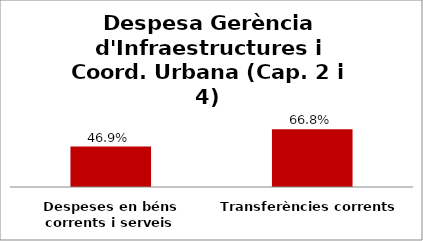
| Category | Series 0 |
|---|---|
| Despeses en béns corrents i serveis | 0.469 |
| Transferències corrents | 0.668 |